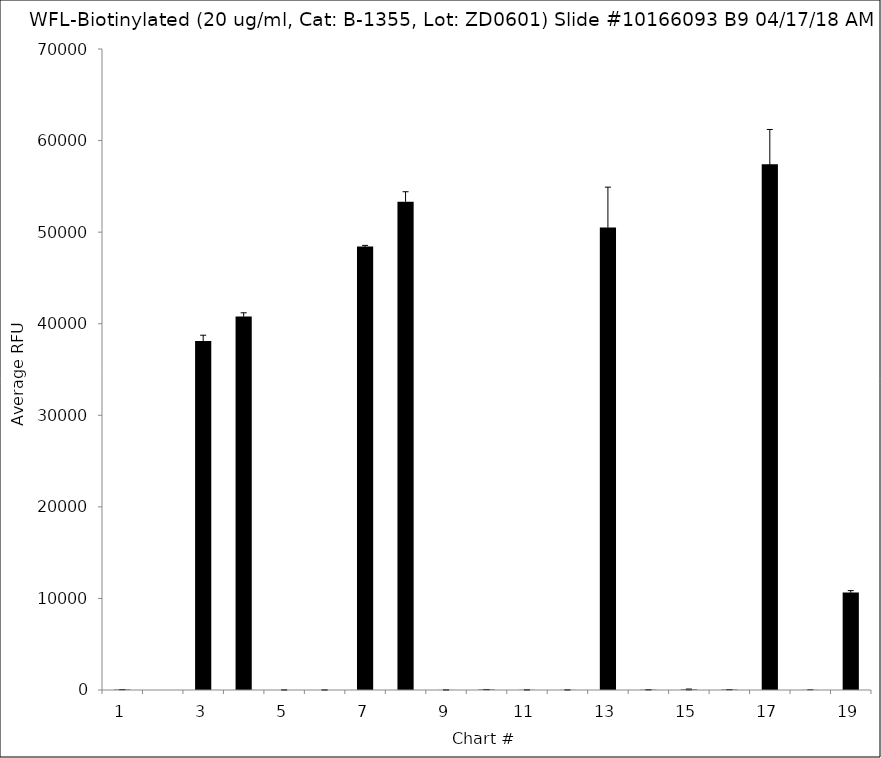
| Category | Series 0 |
|---|---|
| 1.0 | 41.5 |
| 2.0 | -9 |
| 3.0 | 38110.5 |
| 4.0 | 40782 |
| 5.0 | -3.25 |
| 6.0 | -2.75 |
| 7.0 | 48435.5 |
| 8.0 | 53332.5 |
| 9.0 | 8 |
| 10.0 | 45.5 |
| 11.0 | 13.75 |
| 12.0 | 11.5 |
| 13.0 | 50511.75 |
| 14.0 | 25.75 |
| 15.0 | 55.75 |
| 16.0 | 37.75 |
| 17.0 | 57405 |
| 18.0 | 12.25 |
| 19.0 | 10647 |